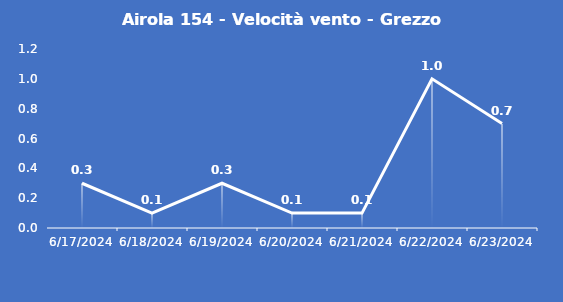
| Category | Airola 154 - Velocità vento - Grezzo (m/s) |
|---|---|
| 6/17/24 | 0.3 |
| 6/18/24 | 0.1 |
| 6/19/24 | 0.3 |
| 6/20/24 | 0.1 |
| 6/21/24 | 0.1 |
| 6/22/24 | 1 |
| 6/23/24 | 0.7 |